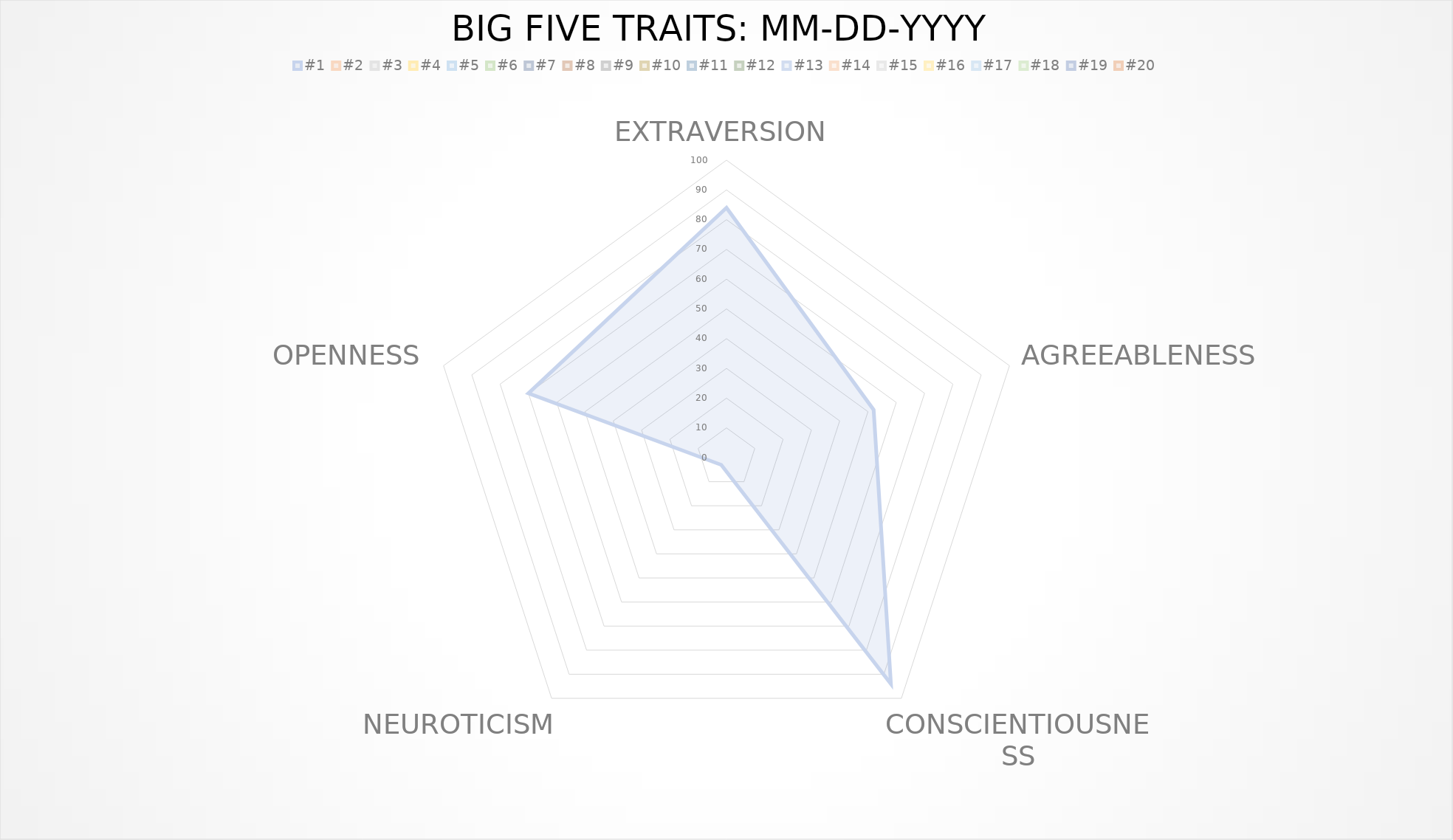
| Category | #1 | #2 | #3 | #4 | #5 | #6 | #7 | #8 | #9 | #10 | #11 | #12 | #13 | #14 | #15 | #16 | #17 | #18 | #19 | #20 |
|---|---|---|---|---|---|---|---|---|---|---|---|---|---|---|---|---|---|---|---|---|
| EXTRAVERSION | 84 | 0 | 0 | 0 | 0 | 0 | 0 | 0 | 0 | 0 | 0 | 0 | 0 | 0 | 0 | 0 | 0 | 0 | 0 | 0 |
| AGREEABLENESS | 52 | 0 | 0 | 0 | 0 | 0 | 0 | 0 | 0 | 0 | 0 | 0 | 0 | 0 | 0 | 0 | 0 | 0 | 0 | 0 |
| CONSCIENTIOUSNESS | 94 | 0 | 0 | 0 | 0 | 0 | 0 | 0 | 0 | 0 | 0 | 0 | 0 | 0 | 0 | 0 | 0 | 0 | 0 | 0 |
| NEUROTICISM | 3 | 0 | 0 | 0 | 0 | 0 | 0 | 0 | 0 | 0 | 0 | 0 | 0 | 0 | 0 | 0 | 0 | 0 | 0 | 0 |
| OPENNESS | 70 | 0 | 0 | 0 | 0 | 0 | 0 | 0 | 0 | 0 | 0 | 0 | 0 | 0 | 0 | 0 | 0 | 0 | 0 | 0 |